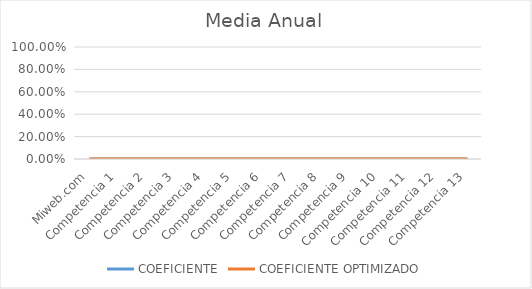
| Category | COEFICIENTE | COEFICIENTE OPTIMIZADO |
|---|---|---|
| Miweb.com | 0 | 0 |
| Competencia 1 | 0 | 0 |
| Competencia 2 | 0 | 0 |
| Competencia 3 | 0 | 0 |
| Competencia 4 | 0 | 0 |
| Competencia 5 | 0 | 0 |
| Competencia 6 | 0 | 0 |
| Competencia 7 | 0 | 0 |
| Competencia 8 | 0 | 0 |
| Competencia 9 | 0 | 0 |
| Competencia 10 | 0 | 0 |
| Competencia 11 | 0 | 0 |
| Competencia 12 | 0 | 0 |
| Competencia 13 | 0 | 0 |